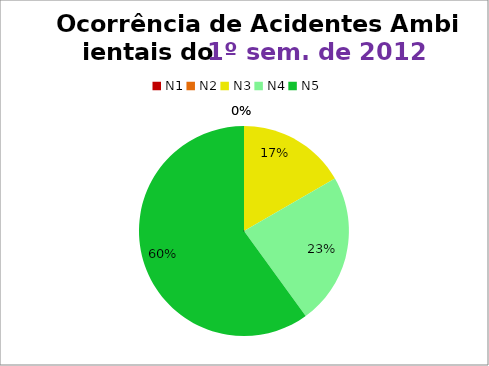
| Category | 1º/12 |
|---|---|
| N1 | 0 |
| N2 | 0 |
| N3 | 5 |
| N4 | 7 |
| N5 | 18 |